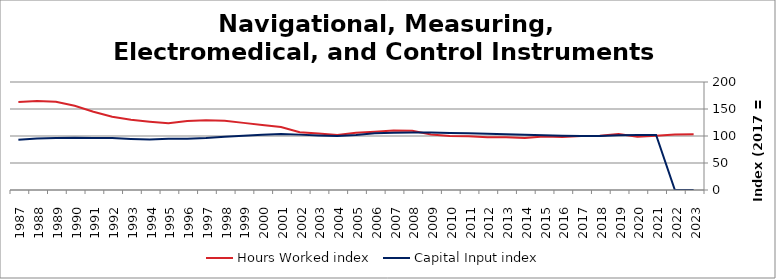
| Category | Hours Worked index | Capital Input index |
|---|---|---|
| 2023.0 | 103.032 | 0 |
| 2022.0 | 102.62 | 0 |
| 2021.0 | 100.497 | 101.774 |
| 2020.0 | 98.468 | 102.066 |
| 2019.0 | 103.825 | 101.225 |
| 2018.0 | 100.364 | 99.894 |
| 2017.0 | 100 | 100 |
| 2016.0 | 97.93 | 100.535 |
| 2015.0 | 99.106 | 101.494 |
| 2014.0 | 96.254 | 102.233 |
| 2013.0 | 97.543 | 103.032 |
| 2012.0 | 97.577 | 104.368 |
| 2011.0 | 99.476 | 105.243 |
| 2010.0 | 99.985 | 105.611 |
| 2009.0 | 102.71 | 106.341 |
| 2008.0 | 109.842 | 106.324 |
| 2007.0 | 110.013 | 106.014 |
| 2006.0 | 107.995 | 104.897 |
| 2005.0 | 105.901 | 101.845 |
| 2004.0 | 101.741 | 100.132 |
| 2003.0 | 104.706 | 101.023 |
| 2002.0 | 106.83 | 102.545 |
| 2001.0 | 116.678 | 103.799 |
| 2000.0 | 120.486 | 102.477 |
| 1999.0 | 124.299 | 100.401 |
| 1998.0 | 128.319 | 98.753 |
| 1997.0 | 129.26 | 96.334 |
| 1996.0 | 127.652 | 95.115 |
| 1995.0 | 123.499 | 94.935 |
| 1994.0 | 126.482 | 93.341 |
| 1993.0 | 130.083 | 94.38 |
| 1992.0 | 135.605 | 96.069 |
| 1991.0 | 144.993 | 96.342 |
| 1990.0 | 156.092 | 96.92 |
| 1989.0 | 163.447 | 96.281 |
| 1988.0 | 164.926 | 95.149 |
| 1987.0 | 162.919 | 92.986 |